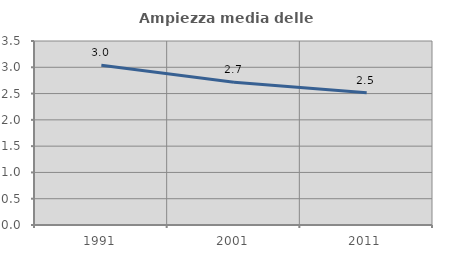
| Category | Ampiezza media delle famiglie |
|---|---|
| 1991.0 | 3.04 |
| 2001.0 | 2.713 |
| 2011.0 | 2.515 |